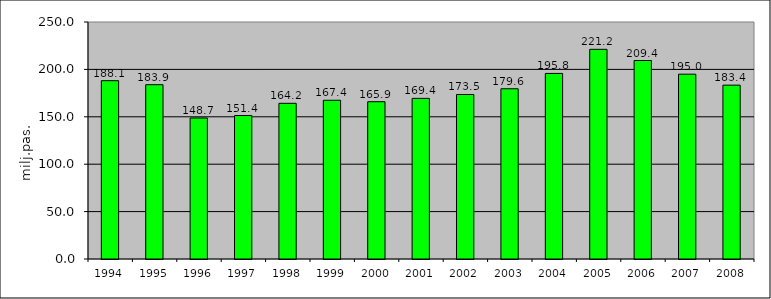
| Category | Series 1 |
|---|---|
| 1994.0 | 188.1 |
| 1995.0 | 183.877 |
| 1996.0 | 148.736 |
| 1997.0 | 151.353 |
| 1998.0 | 164.213 |
| 1999.0 | 167.439 |
| 2000.0 | 165.917 |
| 2001.0 | 169.429 |
| 2002.0 | 173.532 |
| 2003.0 | 179.572 |
| 2004.0 | 195.756 |
| 2005.0 | 221.168 |
| 2006.0 | 209.381 |
| 2007.0 | 194.955 |
| 2008.0 | 183.39 |